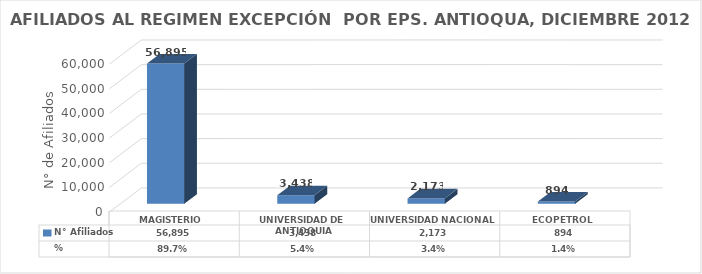
| Category | N° Afiliados | % |
|---|---|---|
| MAGISTERIO | 56895 | 0.897 |
| UNIVERSIDAD DE ANTIOQUIA | 3438 | 0.054 |
| UNIVERSIDAD NACIONAL | 2173 | 0.034 |
| ECOPETROL | 894 | 0.014 |